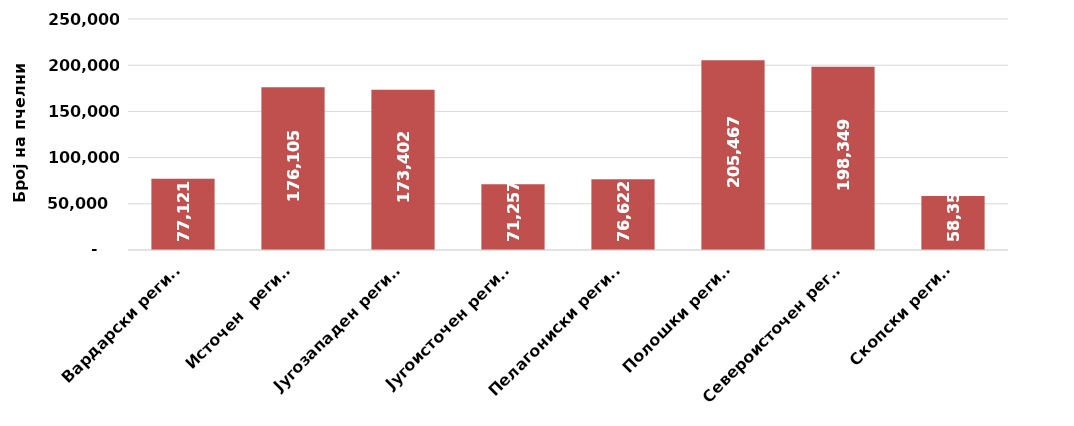
| Category | Вкупно во разгледуваниот период |
|---|---|
| Вардарски регион | 77121 |
| Источен  регион | 176105 |
| Југозападен регион | 173402 |
| Југоисточен регион | 71257 |
| Пелагониски регион | 76622 |
| Полошки регион | 205467 |
| Североисточен регион | 198349 |
| Скопски регион | 58355 |